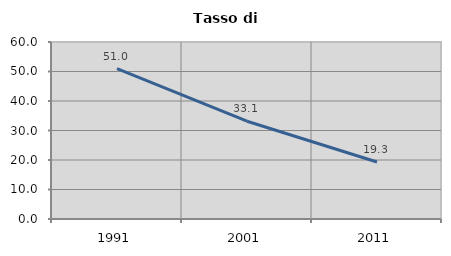
| Category | Tasso di disoccupazione   |
|---|---|
| 1991.0 | 50.975 |
| 2001.0 | 33.147 |
| 2011.0 | 19.325 |